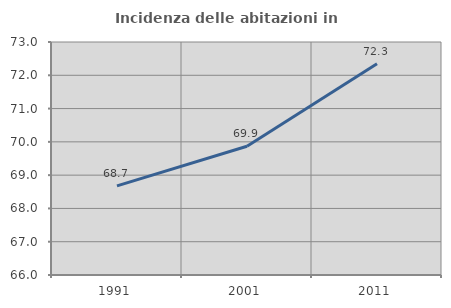
| Category | Incidenza delle abitazioni in proprietà  |
|---|---|
| 1991.0 | 68.677 |
| 2001.0 | 69.868 |
| 2011.0 | 72.347 |